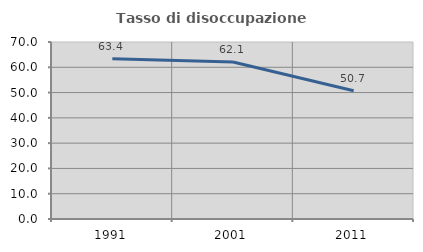
| Category | Tasso di disoccupazione giovanile  |
|---|---|
| 1991.0 | 63.38 |
| 2001.0 | 62.1 |
| 2011.0 | 50.725 |